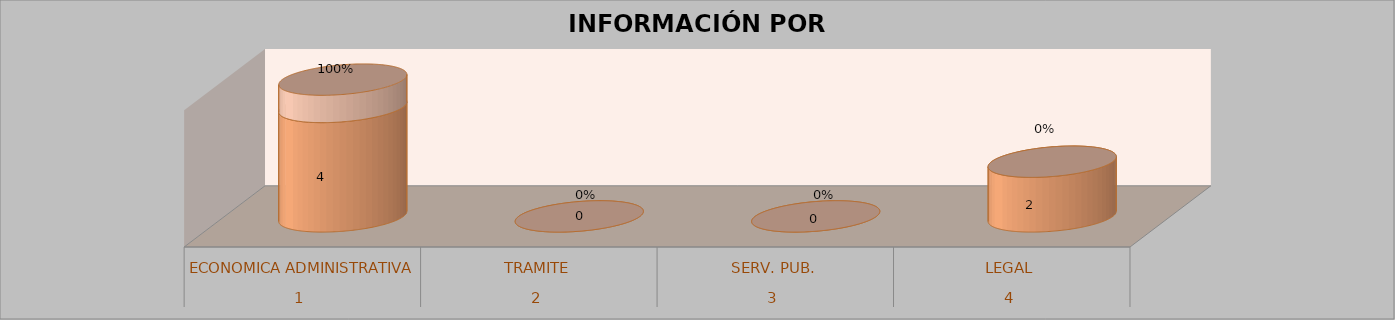
| Category | Series 0 | Series 1 | Series 2 | Series 3 |
|---|---|---|---|---|
| 0 |  |  | 4 | 1 |
| 1 |  |  | 0 | 0 |
| 2 |  |  | 0 | 0 |
| 3 |  |  | 2 | 0 |